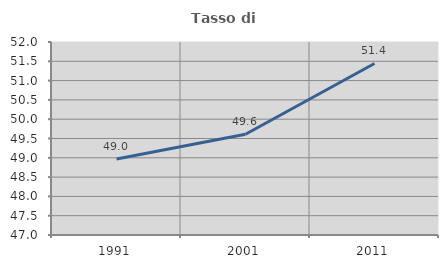
| Category | Tasso di occupazione   |
|---|---|
| 1991.0 | 48.968 |
| 2001.0 | 49.611 |
| 2011.0 | 51.444 |